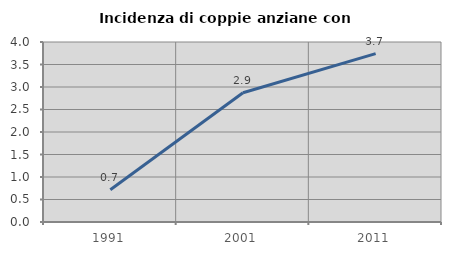
| Category | Incidenza di coppie anziane con figli |
|---|---|
| 1991.0 | 0.717 |
| 2001.0 | 2.872 |
| 2011.0 | 3.743 |